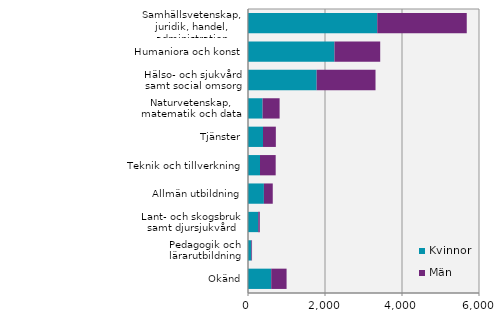
| Category | Kvinnor | Män |
|---|---|---|
| Samhällsvetenskap, juridik, handel, administration | 3357 | 2325 |
| Humaniora och konst | 2246 | 1188 |
| Hälso- och sjukvård samt social omsorg | 1783 | 1529 |
| Naturvetenskap, matematik och data | 379 | 442 |
| Tjänster | 389 | 334 |
| Teknik och tillverkning | 311 | 408 |
| Allmän utbildning | 413 | 230 |
| Lant- och skogsbruk samt djursjukvård | 266 | 40 |
| Pedagogik och lärarutbildning | 87 | 18 |
| Okänd | 603 | 399 |